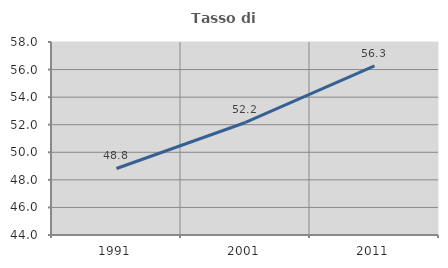
| Category | Tasso di occupazione   |
|---|---|
| 1991.0 | 48.825 |
| 2001.0 | 52.163 |
| 2011.0 | 56.263 |